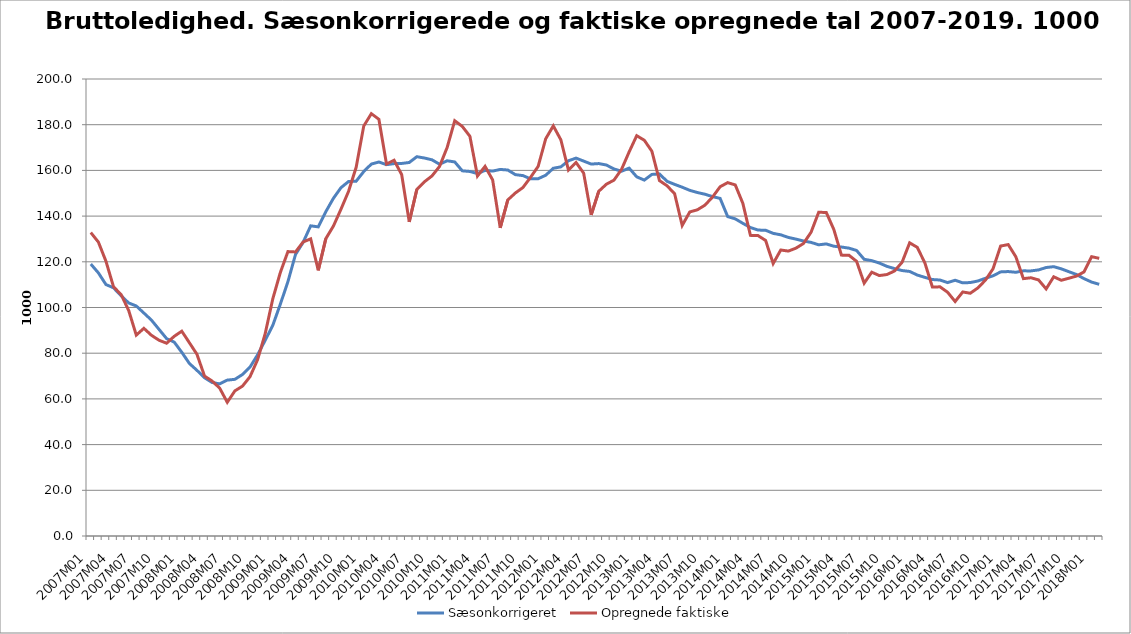
| Category | Sæsonkorrigeret | Opregnede faktiske |
|---|---|---|
| 2007M01 | 119.018 | 132.803 |
| 2007M02 | 115.165 | 128.643 |
| 2007M03 | 110.046 | 120.246 |
| 2007M04 | 108.613 | 109.026 |
| 2007M05 | 105.136 | 105.679 |
| 2007M06 | 101.985 | 98.675 |
| 2007M07 | 100.668 | 87.92 |
| 2007M08 | 97.582 | 90.89 |
| 2007M09 | 94.481 | 87.838 |
| 2007M10 | 90.428 | 85.674 |
| 2007M11 | 86.383 | 84.365 |
| 2007M12 | 84.85 | 87.391 |
| 2008M01 | 80.416 | 89.633 |
| 2008M02 | 75.512 | 84.6 |
| 2008M03 | 72.503 | 79.531 |
| 2008M04 | 69.268 | 69.988 |
| 2008M05 | 67.178 | 67.828 |
| 2008M06 | 66.578 | 64.704 |
| 2008M07 | 68.223 | 58.51 |
| 2008M08 | 68.562 | 63.512 |
| 2008M09 | 70.665 | 65.57 |
| 2008M10 | 73.92 | 69.725 |
| 2008M11 | 79.299 | 77.165 |
| 2008M12 | 85.631 | 88.54 |
| 2009M01 | 92.165 | 103.748 |
| 2009M02 | 101.462 | 115.333 |
| 2009M03 | 111.314 | 124.471 |
| 2009M04 | 123.202 | 124.313 |
| 2009M05 | 128.483 | 128.664 |
| 2009M06 | 135.742 | 130.047 |
| 2009M07 | 135.288 | 116.27 |
| 2009M08 | 141.954 | 130.144 |
| 2009M09 | 147.788 | 135.604 |
| 2009M10 | 152.448 | 143.075 |
| 2009M11 | 155.15 | 150.852 |
| 2009M12 | 155.287 | 161.362 |
| 2010M01 | 159.492 | 179.411 |
| 2010M02 | 162.765 | 184.857 |
| 2010M03 | 163.672 | 182.319 |
| 2010M04 | 162.512 | 162.773 |
| 2010M05 | 162.974 | 164.43 |
| 2010M06 | 163.042 | 158.162 |
| 2010M07 | 163.46 | 137.468 |
| 2010M08 | 165.994 | 151.63 |
| 2010M09 | 165.424 | 155.016 |
| 2010M10 | 164.632 | 157.576 |
| 2010M11 | 162.69 | 161.749 |
| 2010M12 | 164.207 | 170.023 |
| 2011M01 | 163.707 | 181.737 |
| 2011M02 | 159.808 | 179.236 |
| 2011M03 | 159.534 | 174.939 |
| 2011M04 | 158.607 | 157.539 |
| 2011M05 | 160.001 | 161.769 |
| 2011M06 | 159.702 | 155.836 |
| 2011M07 | 160.418 | 134.856 |
| 2011M08 | 160.162 | 147.082 |
| 2011M09 | 158.143 | 150.124 |
| 2011M10 | 157.723 | 152.527 |
| 2011M11 | 156.308 | 156.971 |
| 2011M12 | 156.362 | 161.737 |
| 2012M01 | 157.882 | 173.853 |
| 2012M02 | 160.929 | 179.484 |
| 2012M03 | 161.553 | 173.36 |
| 2012M04 | 164.213 | 160.125 |
| 2012M05 | 165.379 | 163.47 |
| 2012M06 | 164.08 | 158.835 |
| 2012M07 | 162.771 | 140.535 |
| 2012M08 | 162.986 | 150.884 |
| 2012M09 | 162.354 | 153.954 |
| 2012M10 | 160.629 | 155.729 |
| 2012M11 | 159.632 | 160.452 |
| 2012M12 | 161.001 | 168.074 |
| 2013M01 | 157.196 | 175.184 |
| 2013M02 | 155.748 | 173.203 |
| 2013M03 | 158.241 | 168.4 |
| 2013M04 | 158.466 | 155.548 |
| 2013M05 | 155.212 | 153.279 |
| 2013M06 | 153.886 | 149.791 |
| 2013M07 | 152.647 | 135.91 |
| 2013M08 | 151.27 | 141.823 |
| 2013M09 | 150.321 | 142.752 |
| 2013M10 | 149.573 | 144.783 |
| 2013M11 | 148.531 | 148.331 |
| 2013M12 | 147.742 | 152.85 |
| 2014M01 | 139.781 | 154.645 |
| 2014M02 | 138.785 | 153.64 |
| 2014M03 | 136.844 | 145.586 |
| 2014M04 | 134.997 | 131.566 |
| 2014M05 | 133.885 | 131.47 |
| 2014M06 | 133.808 | 129.339 |
| 2014M07 | 132.44 | 119.238 |
| 2014M08 | 131.808 | 125.169 |
| 2014M09 | 130.665 | 124.692 |
| 2014M10 | 129.928 | 125.965 |
| 2014M11 | 129.096 | 128.022 |
| 2014M12 | 128.493 | 132.971 |
| 2015M01 | 127.433 | 141.659 |
| 2015M02 | 127.829 | 141.598 |
| 2015M03 | 126.814 | 134.144 |
| 2015M04 | 126.466 | 122.922 |
| 2015M05 | 125.971 | 122.857 |
| 2015M06 | 124.954 | 120.216 |
| 2015M07 | 121.099 | 110.65 |
| 2015M08 | 120.51 | 115.454 |
| 2015M09 | 119.454 | 113.978 |
| 2015M10 | 118.01 | 114.426 |
| 2015M11 | 117.03 | 115.97 |
| 2015M12 | 116.172 | 119.786 |
| 2016M01 | 115.775 | 128.309 |
| 2016M02 | 114.214 | 126.33 |
| 2016M03 | 113.189 | 119.588 |
| 2016M04 | 112.239 | 108.936 |
| 2016M05 | 112.027 | 109.053 |
| 2016M06 | 110.906 | 106.687 |
| 2016M07 | 111.921 | 102.619 |
| 2016M08 | 110.79 | 106.797 |
| 2016M09 | 110.918 | 106.248 |
| 2016M10 | 111.604 | 108.579 |
| 2016M11 | 112.796 | 111.998 |
| 2016M12 | 113.877 | 116.95 |
| 2017M01 | 115.58 | 126.899 |
| 2017M02 | 115.73 | 127.534 |
| 2017M03 | 115.416 | 122.23 |
| 2017M04 | 116.031 | 112.635 |
| 2017M05 | 116.023 | 113.014 |
| 2017M06 | 116.444 | 112.075 |
| 2017M07 | 117.497 | 108.138 |
| 2017M08 | 117.866 | 113.434 |
| 2017M09 | 116.919 | 111.911 |
| 2017M10 | 115.666 | 112.814 |
| 2017M11 | 114.446 | 113.748 |
| 2017M12 | 112.626 | 115.59 |
| 2018M01 | 111.127 | 122.237 |
| 2018M02 | 110.147 | 121.516 |